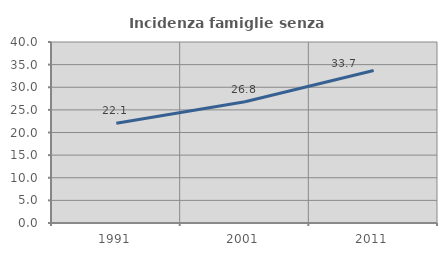
| Category | Incidenza famiglie senza nuclei |
|---|---|
| 1991.0 | 22.057 |
| 2001.0 | 26.801 |
| 2011.0 | 33.691 |